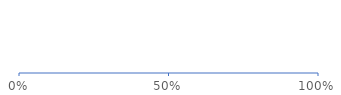
| Category | Overall progress |
|---|---|
| 0 | 0 |